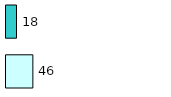
| Category | Series 0 | Series 1 |
|---|---|---|
| 0 | 46 | 18 |